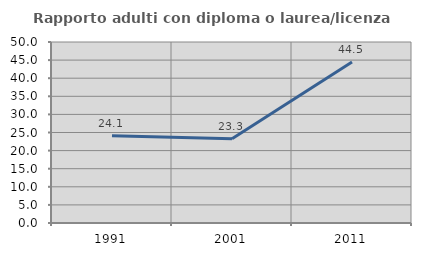
| Category | Rapporto adulti con diploma o laurea/licenza media  |
|---|---|
| 1991.0 | 24.107 |
| 2001.0 | 23.295 |
| 2011.0 | 44.505 |